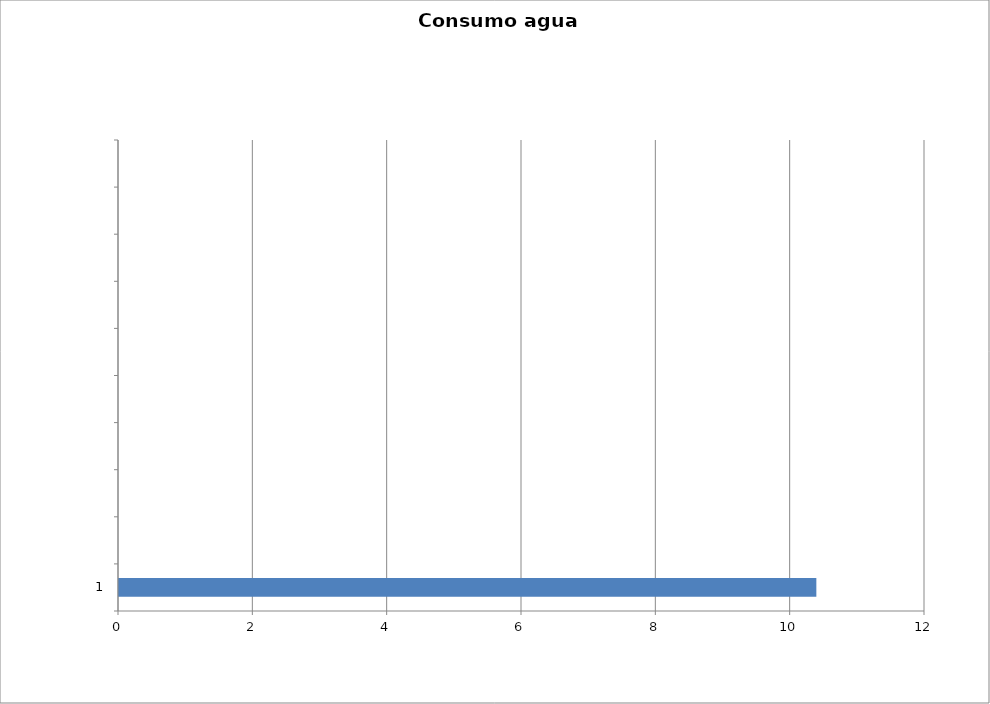
| Category | Series 0 |
|---|---|
| 1 | 10.382 |